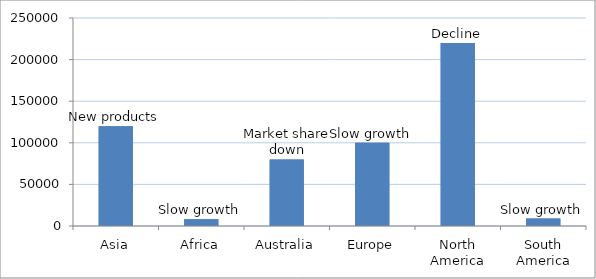
| Category | Sales 2012 |
|---|---|
| Asia | 120000 |
| Africa | 8000 |
| Australia | 80000 |
| Europe | 100000 |
| North America | 220000 |
| South America | 9000 |